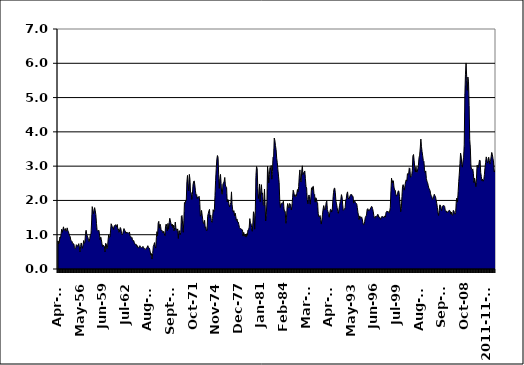
| Category | Series 0 |
|---|---|
| 1953-04-01 | 0.82 |
| 1953-05-01 | 0.73 |
| 1953-06-01 | 0.75 |
| 1953-07-01 | 0.93 |
| 1953-08-01 | 0.9 |
| 1953-09-01 | 1.01 |
| 1953-10-01 | 1.16 |
| 1953-11-01 | 1.07 |
| 1953-12-01 | 1.15 |
| 1954-01-01 | 1.23 |
| 1954-02-01 | 1.14 |
| 1954-03-01 | 1.14 |
| 1954-04-01 | 1.18 |
| 1954-05-01 | 1.1 |
| 1954-06-01 | 1.11 |
| 1954-07-01 | 1.2 |
| 1954-08-01 | 1.13 |
| 1954-09-01 | 1.09 |
| 1954-10-01 | 1.03 |
| 1954-11-01 | 0.97 |
| 1954-12-01 | 0.94 |
| 1955-01-01 | 0.84 |
| 1955-02-01 | 0.82 |
| 1955-03-01 | 0.8 |
| 1955-04-01 | 0.74 |
| 1955-05-01 | 0.74 |
| 1955-06-01 | 0.73 |
| 1955-07-01 | 0.62 |
| 1955-08-01 | 0.59 |
| 1955-09-01 | 0.62 |
| 1955-10-01 | 0.71 |
| 1955-11-01 | 0.69 |
| 1955-12-01 | 0.66 |
| 1956-01-01 | 0.7 |
| 1956-02-01 | 0.74 |
| 1956-03-01 | 0.64 |
| 1956-04-01 | 0.5 |
| 1956-05-01 | 0.66 |
| 1956-06-01 | 0.76 |
| 1956-07-01 | 0.69 |
| 1956-08-01 | 0.6 |
| 1956-09-01 | 0.69 |
| 1956-10-01 | 0.83 |
| 1956-11-01 | 0.75 |
| 1956-12-01 | 0.78 |
| 1957-01-01 | 1.03 |
| 1957-02-01 | 1.13 |
| 1957-03-01 | 1.02 |
| 1957-04-01 | 0.96 |
| 1957-05-01 | 0.92 |
| 1957-06-01 | 0.83 |
| 1957-07-01 | 0.8 |
| 1957-08-01 | 0.89 |
| 1957-09-01 | 1.01 |
| 1957-10-01 | 1.02 |
| 1957-11-01 | 1.37 |
| 1957-12-01 | 1.82 |
| 1958-01-01 | 1.74 |
| 1958-02-01 | 1.61 |
| 1958-03-01 | 1.7 |
| 1958-04-01 | 1.79 |
| 1958-05-01 | 1.7 |
| 1958-06-01 | 1.58 |
| 1958-07-01 | 1.33 |
| 1958-08-01 | 1.13 |
| 1958-09-01 | 1.11 |
| 1958-10-01 | 1.12 |
| 1958-11-01 | 1.13 |
| 1958-12-01 | 0.99 |
| 1959-01-01 | 0.85 |
| 1959-02-01 | 0.93 |
| 1959-03-01 | 0.86 |
| 1959-04-01 | 0.74 |
| 1959-05-01 | 0.65 |
| 1959-06-01 | 0.7 |
| 1959-07-01 | 0.68 |
| 1959-08-01 | 0.66 |
| 1959-09-01 | 0.5 |
| 1959-10-01 | 0.75 |
| 1959-11-01 | 0.73 |
| 1959-12-01 | 0.59 |
| 1960-01-01 | 0.62 |
| 1960-02-01 | 0.85 |
| 1960-03-01 | 1 |
| 1960-04-01 | 0.92 |
| 1960-05-01 | 0.93 |
| 1960-06-01 | 1.11 |
| 1960-07-01 | 1.32 |
| 1960-08-01 | 1.28 |
| 1960-09-01 | 1.21 |
| 1960-10-01 | 1.22 |
| 1960-11-01 | 1.15 |
| 1960-12-01 | 1.26 |
| 1961-01-01 | 1.26 |
| 1961-02-01 | 1.29 |
| 1961-03-01 | 1.28 |
| 1961-04-01 | 1.23 |
| 1961-05-01 | 1.3 |
| 1961-06-01 | 1.15 |
| 1961-07-01 | 1.17 |
| 1961-08-01 | 1.07 |
| 1961-09-01 | 1.14 |
| 1961-10-01 | 1.21 |
| 1961-11-01 | 1.17 |
| 1961-12-01 | 1.04 |
| 1962-01-01 | 1 |
| 1962-02-01 | 1.03 |
| 1962-03-01 | 1.11 |
| 1962-04-01 | 1.18 |
| 1962-05-01 | 1.13 |
| 1962-06-01 | 1.11 |
| 1962-07-01 | 1.04 |
| 1962-08-01 | 1.08 |
| 1962-09-01 | 1.05 |
| 1962-10-01 | 1.06 |
| 1962-11-01 | 1.04 |
| 1962-12-01 | 1.06 |
| 1963-01-01 | 1.08 |
| 1963-02-01 | 0.97 |
| 1963-03-01 | 0.95 |
| 1963-04-01 | 0.9 |
| 1963-05-01 | 0.92 |
| 1963-06-01 | 0.85 |
| 1963-07-01 | 0.82 |
| 1963-08-01 | 0.83 |
| 1963-09-01 | 0.76 |
| 1963-10-01 | 0.72 |
| 1963-11-01 | 0.72 |
| 1963-12-01 | 0.72 |
| 1964-01-01 | 0.66 |
| 1964-02-01 | 0.68 |
| 1964-03-01 | 0.61 |
| 1964-04-01 | 0.62 |
| 1964-05-01 | 0.65 |
| 1964-06-01 | 0.68 |
| 1964-07-01 | 0.64 |
| 1964-08-01 | 0.63 |
| 1964-09-01 | 0.62 |
| 1964-10-01 | 0.62 |
| 1964-11-01 | 0.66 |
| 1964-12-01 | 0.63 |
| 1965-01-01 | 0.61 |
| 1965-02-01 | 0.57 |
| 1965-03-01 | 0.57 |
| 1965-04-01 | 0.6 |
| 1965-05-01 | 0.6 |
| 1965-06-01 | 0.64 |
| 1965-07-01 | 0.68 |
| 1965-08-01 | 0.63 |
| 1965-09-01 | 0.62 |
| 1965-10-01 | 0.58 |
| 1965-11-01 | 0.5 |
| 1965-12-01 | 0.4 |
| 1966-01-01 | 0.45 |
| 1966-02-01 | 0.29 |
| 1966-03-01 | 0.45 |
| 1966-04-01 | 0.66 |
| 1966-05-01 | 0.7 |
| 1966-06-01 | 0.77 |
| 1966-07-01 | 0.66 |
| 1966-08-01 | 0.61 |
| 1966-09-01 | 0.91 |
| 1966-10-01 | 1.09 |
| 1966-11-01 | 0.97 |
| 1966-12-01 | 1.34 |
| 1967-01-01 | 1.39 |
| 1967-02-01 | 1.19 |
| 1967-03-01 | 1.31 |
| 1967-04-01 | 1.24 |
| 1967-05-01 | 1.11 |
| 1967-06-01 | 1.13 |
| 1967-07-01 | 1.1 |
| 1967-08-01 | 1.05 |
| 1967-09-01 | 1.1 |
| 1967-10-01 | 1.04 |
| 1967-11-01 | 0.97 |
| 1967-12-01 | 1.23 |
| 1968-01-01 | 1.31 |
| 1968-02-01 | 1.24 |
| 1968-03-01 | 1.11 |
| 1968-04-01 | 1.33 |
| 1968-05-01 | 1.16 |
| 1968-06-01 | 1.35 |
| 1968-07-01 | 1.48 |
| 1968-08-01 | 1.4 |
| 1968-09-01 | 1.33 |
| 1968-10-01 | 1.26 |
| 1968-11-01 | 1.31 |
| 1968-12-01 | 1.2 |
| 1969-01-01 | 1.28 |
| 1969-02-01 | 1.11 |
| 1969-03-01 | 1.21 |
| 1969-04-01 | 1.37 |
| 1969-05-01 | 1.2 |
| 1969-06-01 | 1.13 |
| 1969-07-01 | 1.12 |
| 1969-08-01 | 1.17 |
| 1969-09-01 | 0.89 |
| 1969-10-01 | 1.12 |
| 1969-11-01 | 1.11 |
| 1969-12-01 | 1 |
| 1970-01-01 | 1.07 |
| 1970-02-01 | 1.54 |
| 1970-03-01 | 1.56 |
| 1970-04-01 | 1.31 |
| 1970-05-01 | 1.07 |
| 1970-06-01 | 1.41 |
| 1970-07-01 | 1.94 |
| 1970-08-01 | 1.91 |
| 1970-09-01 | 2 |
| 1970-10-01 | 2 |
| 1970-11-01 | 2.54 |
| 1970-12-01 | 2.73 |
| 1971-01-01 | 2.5 |
| 1971-02-01 | 2.28 |
| 1971-03-01 | 2.76 |
| 1971-04-01 | 2.62 |
| 1971-05-01 | 2.23 |
| 1971-06-01 | 2.23 |
| 1971-07-01 | 2.03 |
| 1971-08-01 | 2.18 |
| 1971-09-01 | 2.45 |
| 1971-10-01 | 2.55 |
| 1971-11-01 | 2.57 |
| 1971-12-01 | 2.45 |
| 1972-01-01 | 2.28 |
| 1972-02-01 | 2.15 |
| 1972-03-01 | 2.17 |
| 1972-04-01 | 2.05 |
| 1972-05-01 | 2.1 |
| 1972-06-01 | 2.09 |
| 1972-07-01 | 2.12 |
| 1972-08-01 | 1.98 |
| 1972-09-01 | 1.54 |
| 1972-10-01 | 1.58 |
| 1972-11-01 | 1.71 |
| 1972-12-01 | 1.57 |
| 1973-01-01 | 1.44 |
| 1973-02-01 | 1.33 |
| 1973-03-01 | 1.32 |
| 1973-04-01 | 1.42 |
| 1973-05-01 | 1.21 |
| 1973-06-01 | 1.23 |
| 1973-07-01 | 1.11 |
| 1973-08-01 | 1.13 |
| 1973-09-01 | 1.54 |
| 1973-10-01 | 1.62 |
| 1973-11-01 | 1.69 |
| 1973-12-01 | 1.74 |
| 1974-01-01 | 1.49 |
| 1974-02-01 | 1.57 |
| 1974-03-01 | 1.41 |
| 1974-04-01 | 1.36 |
| 1974-05-01 | 1.47 |
| 1974-06-01 | 1.73 |
| 1974-07-01 | 1.67 |
| 1974-08-01 | 1.73 |
| 1974-09-01 | 2.14 |
| 1974-10-01 | 2.58 |
| 1974-11-01 | 2.92 |
| 1974-12-01 | 3.2 |
| 1975-01-01 | 3.31 |
| 1975-02-01 | 3.26 |
| 1975-03-01 | 2.75 |
| 1975-04-01 | 2.35 |
| 1975-05-01 | 2.63 |
| 1975-06-01 | 2.76 |
| 1975-07-01 | 2.49 |
| 1975-08-01 | 2.19 |
| 1975-09-01 | 2.18 |
| 1975-10-01 | 2.48 |
| 1975-11-01 | 2.51 |
| 1975-12-01 | 2.56 |
| 1976-01-01 | 2.67 |
| 1976-02-01 | 2.45 |
| 1976-03-01 | 2.39 |
| 1976-04-01 | 2.38 |
| 1976-05-01 | 1.96 |
| 1976-06-01 | 2.03 |
| 1976-07-01 | 1.99 |
| 1976-08-01 | 1.87 |
| 1976-09-01 | 1.81 |
| 1976-10-01 | 1.88 |
| 1976-11-01 | 1.94 |
| 1976-12-01 | 2.25 |
| 1977-01-01 | 1.87 |
| 1977-02-01 | 1.73 |
| 1977-03-01 | 1.66 |
| 1977-04-01 | 1.7 |
| 1977-05-01 | 1.55 |
| 1977-06-01 | 1.63 |
| 1977-07-01 | 1.54 |
| 1977-08-01 | 1.42 |
| 1977-09-01 | 1.46 |
| 1977-10-01 | 1.37 |
| 1977-11-01 | 1.37 |
| 1977-12-01 | 1.3 |
| 1978-01-01 | 1.21 |
| 1978-02-01 | 1.17 |
| 1978-03-01 | 1.18 |
| 1978-04-01 | 1.17 |
| 1978-05-01 | 1.14 |
| 1978-06-01 | 1.14 |
| 1978-07-01 | 0.96 |
| 1978-08-01 | 1.07 |
| 1978-09-01 | 1 |
| 1978-10-01 | 0.95 |
| 1978-11-01 | 1.02 |
| 1978-12-01 | 0.93 |
| 1979-01-01 | 1.03 |
| 1979-02-01 | 0.98 |
| 1979-03-01 | 1.14 |
| 1979-04-01 | 1.15 |
| 1979-05-01 | 1.22 |
| 1979-06-01 | 1.47 |
| 1979-07-01 | 1.34 |
| 1979-08-01 | 1.32 |
| 1979-09-01 | 1.21 |
| 1979-10-01 | 1.1 |
| 1979-11-01 | 1.34 |
| 1979-12-01 | 1.67 |
| 1980-01-01 | 1.62 |
| 1980-02-01 | 1.16 |
| 1980-03-01 | 1.7 |
| 1980-04-01 | 2.72 |
| 1980-05-01 | 2.99 |
| 1980-06-01 | 2.93 |
| 1980-07-01 | 2.4 |
| 1980-08-01 | 2.05 |
| 1980-09-01 | 2.19 |
| 1980-10-01 | 2.48 |
| 1980-11-01 | 1.96 |
| 1980-12-01 | 2.3 |
| 1981-01-01 | 2.46 |
| 1981-02-01 | 2.18 |
| 1981-03-01 | 2.22 |
| 1981-04-01 | 1.88 |
| 1981-05-01 | 1.85 |
| 1981-06-01 | 2.33 |
| 1981-07-01 | 1.89 |
| 1981-08-01 | 1.4 |
| 1981-09-01 | 1.6 |
| 1981-10-01 | 1.96 |
| 1981-11-01 | 3 |
| 1981-12-01 | 2.83 |
| 1982-01-01 | 2.51 |
| 1982-02-01 | 2.75 |
| 1982-03-01 | 2.96 |
| 1982-04-01 | 2.91 |
| 1982-05-01 | 3.02 |
| 1982-06-01 | 2.62 |
| 1982-07-01 | 2.85 |
| 1982-08-01 | 3.26 |
| 1982-09-01 | 3.29 |
| 1982-10-01 | 3.82 |
| 1982-11-01 | 3.75 |
| 1982-12-01 | 3.6 |
| 1983-01-01 | 3.48 |
| 1983-02-01 | 3.23 |
| 1983-03-01 | 3.1 |
| 1983-04-01 | 2.89 |
| 1983-05-01 | 2.71 |
| 1983-06-01 | 2.52 |
| 1983-07-01 | 2.01 |
| 1983-08-01 | 1.79 |
| 1983-09-01 | 1.9 |
| 1983-10-01 | 1.92 |
| 1983-11-01 | 1.92 |
| 1983-12-01 | 1.92 |
| 1984-01-01 | 1.98 |
| 1984-02-01 | 1.75 |
| 1984-03-01 | 1.67 |
| 1984-04-01 | 1.68 |
| 1984-05-01 | 1.33 |
| 1984-06-01 | 1.49 |
| 1984-07-01 | 1.79 |
| 1984-08-01 | 1.91 |
| 1984-09-01 | 1.83 |
| 1984-10-01 | 1.78 |
| 1984-11-01 | 1.91 |
| 1984-12-01 | 1.9 |
| 1985-01-01 | 1.88 |
| 1985-02-01 | 1.72 |
| 1985-03-01 | 1.83 |
| 1985-04-01 | 2.08 |
| 1985-05-01 | 2.3 |
| 1985-06-01 | 2.24 |
| 1985-07-01 | 2.12 |
| 1985-08-01 | 2.17 |
| 1985-09-01 | 2.11 |
| 1985-10-01 | 2.12 |
| 1985-11-01 | 2.21 |
| 1985-12-01 | 2.32 |
| 1986-01-01 | 2.25 |
| 1986-02-01 | 2.41 |
| 1986-03-01 | 2.72 |
| 1986-04-01 | 2.89 |
| 1986-05-01 | 2.58 |
| 1986-06-01 | 2.54 |
| 1986-07-01 | 2.86 |
| 1986-08-01 | 3.01 |
| 1986-09-01 | 2.75 |
| 1986-10-01 | 2.81 |
| 1986-11-01 | 2.82 |
| 1986-12-01 | 2.86 |
| 1987-01-01 | 2.64 |
| 1987-02-01 | 2.4 |
| 1987-03-01 | 2.36 |
| 1987-04-01 | 2.02 |
| 1987-05-01 | 1.9 |
| 1987-06-01 | 2.12 |
| 1987-07-01 | 2.16 |
| 1987-08-01 | 2.04 |
| 1987-09-01 | 1.89 |
| 1987-10-01 | 2.1 |
| 1987-11-01 | 2.37 |
| 1987-12-01 | 2.3 |
| 1988-01-01 | 2.4 |
| 1988-02-01 | 2.41 |
| 1988-03-01 | 2.2 |
| 1988-04-01 | 2.18 |
| 1988-05-01 | 1.95 |
| 1988-06-01 | 2.08 |
| 1988-07-01 | 2.05 |
| 1988-08-01 | 1.95 |
| 1988-09-01 | 1.92 |
| 1988-10-01 | 1.61 |
| 1988-11-01 | 1.52 |
| 1988-12-01 | 1.54 |
| 1989-01-01 | 1.56 |
| 1989-02-01 | 1.44 |
| 1989-03-01 | 1.31 |
| 1989-04-01 | 1.43 |
| 1989-05-01 | 1.6 |
| 1989-06-01 | 1.75 |
| 1989-07-01 | 1.85 |
| 1989-08-01 | 1.77 |
| 1989-09-01 | 1.72 |
| 1989-10-01 | 1.8 |
| 1989-11-01 | 1.94 |
| 1989-12-01 | 1.98 |
| 1990-01-01 | 1.73 |
| 1990-02-01 | 1.67 |
| 1990-03-01 | 1.62 |
| 1990-04-01 | 1.51 |
| 1990-05-01 | 1.65 |
| 1990-06-01 | 1.74 |
| 1990-07-01 | 1.73 |
| 1990-08-01 | 1.66 |
| 1990-09-01 | 1.75 |
| 1990-10-01 | 2.02 |
| 1990-11-01 | 2.23 |
| 1990-12-01 | 2.35 |
| 1991-01-01 | 2.36 |
| 1991-02-01 | 2.22 |
| 1991-03-01 | 1.98 |
| 1991-04-01 | 1.9 |
| 1991-05-01 | 1.79 |
| 1991-06-01 | 1.68 |
| 1991-07-01 | 1.62 |
| 1991-08-01 | 1.75 |
| 1991-09-01 | 1.86 |
| 1991-10-01 | 1.96 |
| 1991-11-01 | 2.03 |
| 1991-12-01 | 2.17 |
| 1992-01-01 | 2.1 |
| 1992-02-01 | 1.89 |
| 1992-03-01 | 1.71 |
| 1992-04-01 | 1.73 |
| 1992-05-01 | 1.74 |
| 1992-06-01 | 1.79 |
| 1992-07-01 | 2 |
| 1992-08-01 | 2.06 |
| 1992-09-01 | 2.2 |
| 1992-10-01 | 2.25 |
| 1992-11-01 | 2.09 |
| 1992-12-01 | 2.04 |
| 1993-01-01 | 2.07 |
| 1993-02-01 | 2.13 |
| 1993-03-01 | 2.17 |
| 1993-04-01 | 2.17 |
| 1993-05-01 | 2.17 |
| 1993-06-01 | 2.11 |
| 1993-07-01 | 2.12 |
| 1993-08-01 | 1.92 |
| 1993-09-01 | 1.98 |
| 1993-10-01 | 1.98 |
| 1993-11-01 | 1.94 |
| 1993-12-01 | 1.92 |
| 1994-01-01 | 1.9 |
| 1994-02-01 | 1.79 |
| 1994-03-01 | 1.65 |
| 1994-04-01 | 1.55 |
| 1994-05-01 | 1.44 |
| 1994-06-01 | 1.55 |
| 1994-07-01 | 1.5 |
| 1994-08-01 | 1.5 |
| 1994-09-01 | 1.52 |
| 1994-10-01 | 1.46 |
| 1994-11-01 | 1.36 |
| 1994-12-01 | 1.29 |
| 1995-01-01 | 1.3 |
| 1995-02-01 | 1.38 |
| 1995-03-01 | 1.5 |
| 1995-04-01 | 1.54 |
| 1995-05-01 | 1.57 |
| 1995-06-01 | 1.73 |
| 1995-07-01 | 1.76 |
| 1995-08-01 | 1.7 |
| 1995-09-01 | 1.73 |
| 1995-10-01 | 1.71 |
| 1995-11-01 | 1.75 |
| 1995-12-01 | 1.78 |
| 1996-01-01 | 1.82 |
| 1996-02-01 | 1.82 |
| 1996-03-01 | 1.76 |
| 1996-04-01 | 1.68 |
| 1996-05-01 | 1.56 |
| 1996-06-01 | 1.49 |
| 1996-07-01 | 1.48 |
| 1996-08-01 | 1.54 |
| 1996-09-01 | 1.52 |
| 1996-10-01 | 1.54 |
| 1996-11-01 | 1.59 |
| 1996-12-01 | 1.59 |
| 1997-01-01 | 1.51 |
| 1997-02-01 | 1.52 |
| 1997-03-01 | 1.49 |
| 1997-04-01 | 1.45 |
| 1997-05-01 | 1.49 |
| 1997-06-01 | 1.53 |
| 1997-07-01 | 1.53 |
| 1997-08-01 | 1.52 |
| 1997-09-01 | 1.49 |
| 1997-10-01 | 1.54 |
| 1997-11-01 | 1.54 |
| 1997-12-01 | 1.51 |
| 1998-01-01 | 1.65 |
| 1998-02-01 | 1.68 |
| 1998-03-01 | 1.67 |
| 1998-04-01 | 1.69 |
| 1998-05-01 | 1.65 |
| 1998-06-01 | 1.63 |
| 1998-07-01 | 1.69 |
| 1998-08-01 | 1.8 |
| 1998-09-01 | 2.28 |
| 1998-10-01 | 2.65 |
| 1998-11-01 | 2.51 |
| 1998-12-01 | 2.58 |
| 1999-01-01 | 2.57 |
| 1999-02-01 | 2.39 |
| 1999-03-01 | 2.3 |
| 1999-04-01 | 2.3 |
| 1999-05-01 | 2.18 |
| 1999-06-01 | 2.12 |
| 1999-07-01 | 2.16 |
| 1999-08-01 | 2.21 |
| 1999-09-01 | 2.28 |
| 1999-10-01 | 2.27 |
| 1999-11-01 | 2.12 |
| 1999-12-01 | 1.91 |
| 2000-01-01 | 1.67 |
| 2000-02-01 | 1.77 |
| 2000-03-01 | 2.11 |
| 2000-04-01 | 2.41 |
| 2000-05-01 | 2.46 |
| 2000-06-01 | 2.38 |
| 2000-07-01 | 2.3 |
| 2000-08-01 | 2.43 |
| 2000-09-01 | 2.55 |
| 2000-10-01 | 2.6 |
| 2000-11-01 | 2.56 |
| 2000-12-01 | 2.78 |
| 2001-01-01 | 2.77 |
| 2001-02-01 | 2.77 |
| 2001-03-01 | 2.95 |
| 2001-04-01 | 2.93 |
| 2001-05-01 | 2.68 |
| 2001-06-01 | 2.69 |
| 2001-07-01 | 2.73 |
| 2001-08-01 | 2.88 |
| 2001-09-01 | 3.3 |
| 2001-10-01 | 3.34 |
| 2001-11-01 | 3.16 |
| 2001-12-01 | 2.96 |
| 2002-01-01 | 2.83 |
| 2002-02-01 | 2.98 |
| 2002-03-01 | 2.83 |
| 2002-04-01 | 2.82 |
| 2002-05-01 | 2.93 |
| 2002-06-01 | 3.02 |
| 2002-07-01 | 3.25 |
| 2002-08-01 | 3.32 |
| 2002-09-01 | 3.53 |
| 2002-10-01 | 3.79 |
| 2002-11-01 | 3.57 |
| 2002-12-01 | 3.42 |
| 2003-01-01 | 3.3 |
| 2003-02-01 | 3.16 |
| 2003-03-01 | 3.14 |
| 2003-04-01 | 2.89 |
| 2003-05-01 | 2.81 |
| 2003-06-01 | 2.86 |
| 2003-07-01 | 2.64 |
| 2003-08-01 | 2.56 |
| 2003-09-01 | 2.52 |
| 2003-10-01 | 2.44 |
| 2003-11-01 | 2.36 |
| 2003-12-01 | 2.33 |
| 2004-01-01 | 2.29 |
| 2004-02-01 | 2.19 |
| 2004-03-01 | 2.13 |
| 2004-04-01 | 2.11 |
| 2004-05-01 | 2.03 |
| 2004-06-01 | 2.05 |
| 2004-07-01 | 2.12 |
| 2004-08-01 | 2.18 |
| 2004-09-01 | 2.14 |
| 2004-10-01 | 2.11 |
| 2004-11-01 | 2.01 |
| 2004-12-01 | 1.92 |
| 2005-01-01 | 1.8 |
| 2005-02-01 | 1.65 |
| 2005-03-01 | 1.56 |
| 2005-04-01 | 1.71 |
| 2005-05-01 | 1.87 |
| 2005-06-01 | 1.86 |
| 2005-07-01 | 1.77 |
| 2005-08-01 | 1.7 |
| 2005-09-01 | 1.83 |
| 2005-10-01 | 1.84 |
| 2005-11-01 | 1.85 |
| 2005-12-01 | 1.85 |
| 2006-01-01 | 1.82 |
| 2006-02-01 | 1.7 |
| 2006-03-01 | 1.69 |
| 2006-04-01 | 1.69 |
| 2006-05-01 | 1.64 |
| 2006-06-01 | 1.67 |
| 2006-07-01 | 1.67 |
| 2006-08-01 | 1.71 |
| 2006-09-01 | 1.71 |
| 2006-10-01 | 1.69 |
| 2006-11-01 | 1.6 |
| 2006-12-01 | 1.66 |
| 2007-01-01 | 1.58 |
| 2007-02-01 | 1.56 |
| 2007-03-01 | 1.71 |
| 2007-04-01 | 1.7 |
| 2007-05-01 | 1.64 |
| 2007-06-01 | 1.6 |
| 2007-07-01 | 1.65 |
| 2007-08-01 | 1.98 |
| 2007-09-01 | 2.07 |
| 2007-10-01 | 1.95 |
| 2007-11-01 | 2.25 |
| 2007-12-01 | 2.55 |
| 2008-01-01 | 2.8 |
| 2008-02-01 | 3.08 |
| 2008-03-01 | 3.38 |
| 2008-04-01 | 3.29 |
| 2008-05-01 | 3.05 |
| 2008-06-01 | 2.97 |
| 2008-07-01 | 3.15 |
| 2008-08-01 | 3.26 |
| 2008-09-01 | 3.62 |
| 2008-10-01 | 5.07 |
| 2008-11-01 | 5.68 |
| 2008-12-01 | 6.01 |
| 2009-01-01 | 5.62 |
| 2009-02-01 | 5.21 |
| 2009-03-01 | 5.6 |
| 2009-04-01 | 5.46 |
| 2009-05-01 | 4.77 |
| 2009-06-01 | 3.78 |
| 2009-07-01 | 3.53 |
| 2009-08-01 | 2.99 |
| 2009-09-01 | 2.91 |
| 2009-10-01 | 2.9 |
| 2009-11-01 | 2.92 |
| 2009-12-01 | 2.78 |
| 2010-01-01 | 2.52 |
| 2010-02-01 | 2.65 |
| 2010-03-01 | 2.54 |
| 2010-04-01 | 2.4 |
| 2010-05-01 | 2.63 |
| 2010-06-01 | 3.03 |
| 2010-07-01 | 3 |
| 2010-08-01 | 2.96 |
| 2010-09-01 | 3.06 |
| 2010-10-01 | 3.18 |
| 2010-11-01 | 3.16 |
| 2010-12-01 | 2.81 |
| 2011-01-01 | 2.7 |
| 2011-02-01 | 2.57 |
| 2011-03-01 | 2.62 |
| 2011-04-01 | 2.56 |
| 2011-05-01 | 2.61 |
| 2011-06-01 | 2.75 |
| 2011-07-01 | 2.96 |
| 2011-08-01 | 3.11 |
| 2011-09-01 | 3.27 |
| 2011-10-01 | 3.22 |
| 2011-11-01 | 3.09 |
| 2011-12-01 | 3.14 |
| 2012-01-01 | 3.26 |
| 2012-02-01 | 3.17 |
| 2012-03-01 | 3.06 |
| 2012-04-01 | 3.14 |
| 2012-05-01 | 3.27 |
| 2012-06-01 | 3.4 |
| 2012-07-01 | 3.34 |
| 2012-08-01 | 3.23 |
| 2012-09-01 | 3.12 |
| 2012-10-01 | 2.83 |
| 2012-11-01 | 2.86 |
| 2012-12-01 | 2.91 |
| 2013-01-01 | 2.82 |